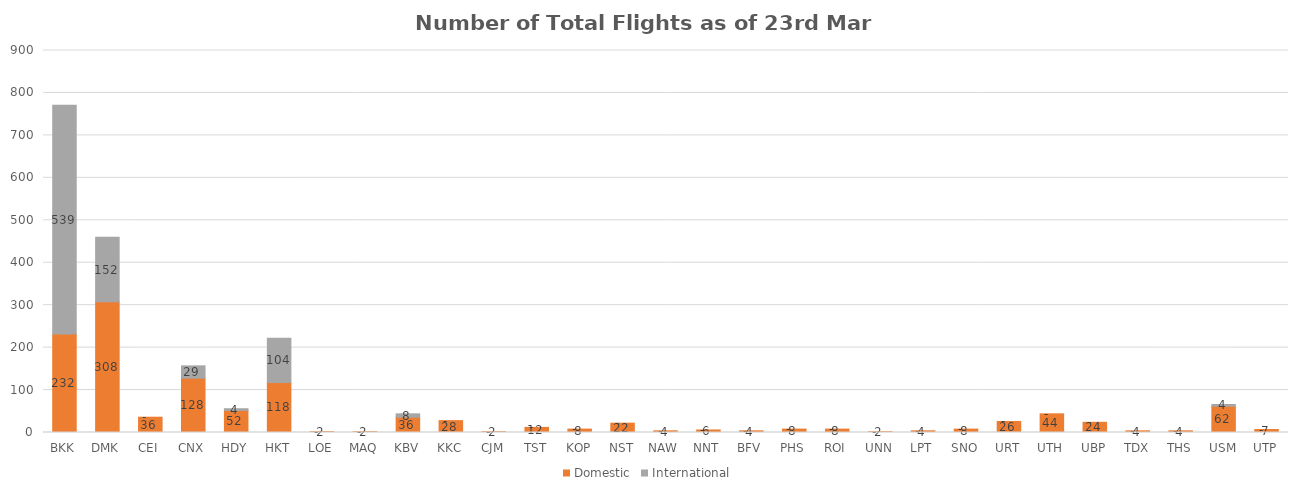
| Category | Domestic | International |
|---|---|---|
| BKK | 232 | 539 |
| DMK | 308 | 152 |
| CEI | 36 | 0 |
| CNX | 128 | 29 |
| HDY | 52 | 4 |
| HKT | 118 | 104 |
| LOE | 2 | 0 |
| MAQ | 2 | 0 |
| KBV | 36 | 8 |
| KKC | 28 | 0 |
| CJM | 2 | 0 |
| TST | 12 | 0 |
| KOP | 8 | 0 |
| NST | 22 | 0 |
| NAW | 4 | 0 |
| NNT | 6 | 0 |
| BFV | 4 | 0 |
| PHS | 8 | 0 |
| ROI | 8 | 0 |
| UNN | 2 | 0 |
| LPT | 4 | 0 |
| SNO | 8 | 0 |
| URT | 26 | 0 |
| UTH | 44 | 0 |
| UBP | 24 | 0 |
| TDX | 4 | 0 |
| THS | 4 | 0 |
| USM | 62 | 4 |
| UTP | 7 | 0 |